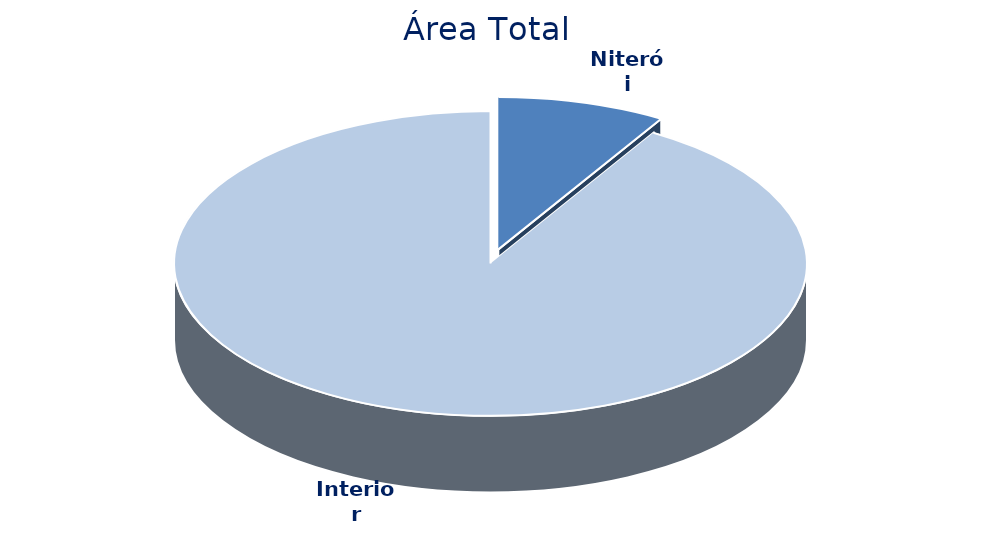
| Category | Área Total |
|---|---|
| Niterói | 516799 |
| Interior | 5488072 |